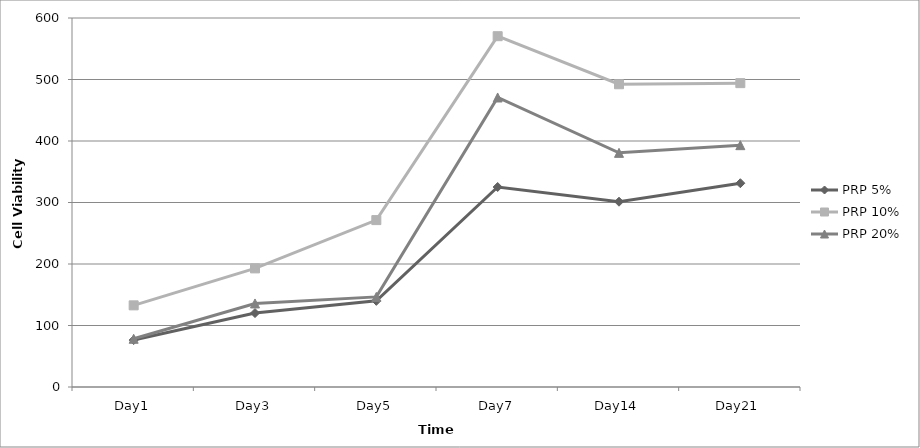
| Category | PRP 5% | PRP 10% | PRP 20% |
|---|---|---|---|
| Day1 | 76.342 | 132.749 | 78.423 |
| Day3 | 120.199 | 192.881 | 135.844 |
| Day5 | 140.069 | 271.367 | 146.518 |
| Day7 | 325.197 | 570.414 | 470.759 |
| Day14 | 301.282 | 492.265 | 380.726 |
| Day21 | 331.335 | 494.101 | 393.23 |